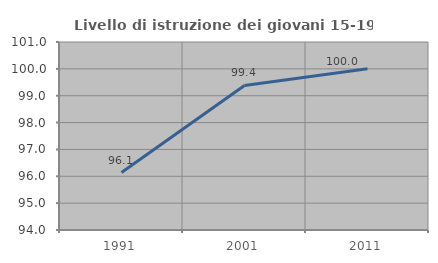
| Category | Livello di istruzione dei giovani 15-19 anni |
|---|---|
| 1991.0 | 96.139 |
| 2001.0 | 99.383 |
| 2011.0 | 100 |